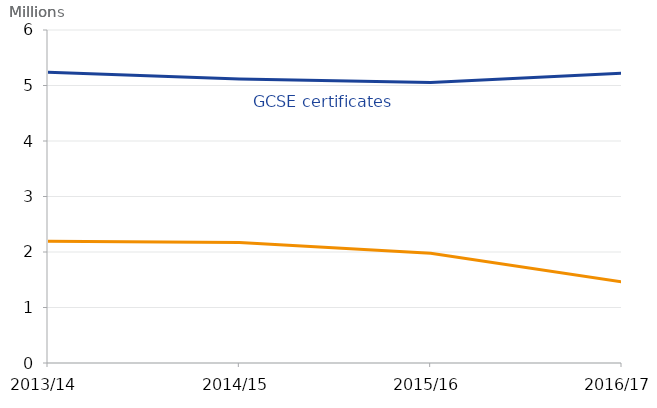
| Category | Number of GCSE certifications | Number of A level certifications |
|---|---|---|
| 2013/14 | 5240135 | 2192910 |
| 2014/15 | 5115895 | 2170375 |
| 2015/16 | 5055890 | 1978165 |
| 2016/17 | 5223015 | 1461030 |